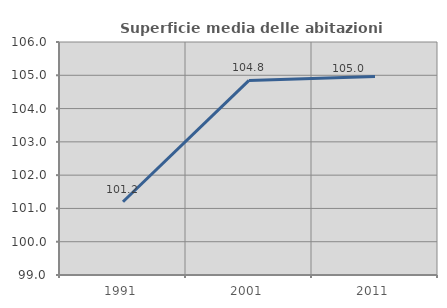
| Category | Superficie media delle abitazioni occupate |
|---|---|
| 1991.0 | 101.2 |
| 2001.0 | 104.847 |
| 2011.0 | 104.963 |